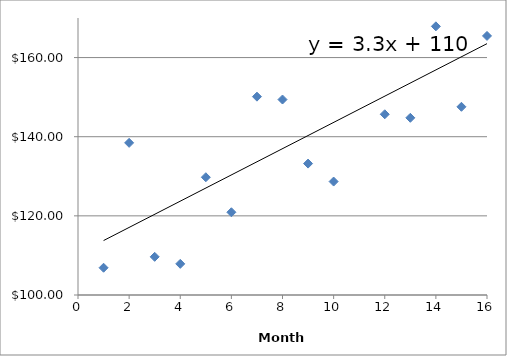
| Category | Series 0 |
|---|---|
| 1.0 | 106.89 |
| 2.0 | 138.45 |
| 3.0 | 109.65 |
| 4.0 | 107.87 |
| 5.0 | 129.76 |
| 6.0 | 120.91 |
| 7.0 | 150.12 |
| 8.0 | 149.4 |
| 9.0 | 133.21 |
| 10.0 | 128.67 |
| 11.0 | 171.92 |
| 12.0 | 145.67 |
| 13.0 | 144.78 |
| 14.0 | 167.89 |
| 15.0 | 147.56 |
| 16.0 | 165.47 |